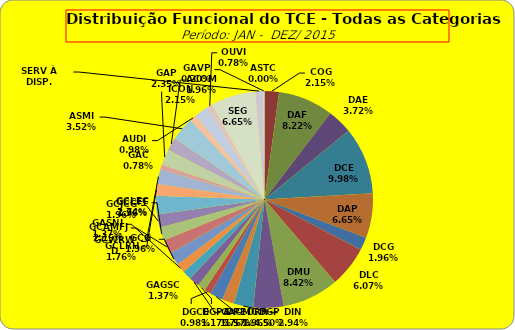
| Category | ASTC COG DAF DAE DCE DAP DCG DLC DMU DGP DIN DPE DRR DGCE DGPA GACMG GAGSC GASNI GCG GCAMFJ GCCFF GCJCG GCLEC GCLRH GCWRWD GAC GAP ACOM ASMI AUDI ICON OUVI SEG SERV À DISP. GAVP |
|---|---|
| ASTC | 0 |
| COG | 11 |
| DAF | 42 |
| DAE | 19 |
| DCE | 51 |
| DAP | 34 |
| DCG | 10 |
| DLC | 31 |
| DMU | 43 |
| DGP | 23 |
| DIN | 15 |
| DPE | 9 |
| DRR | 10 |
| DGCE | 5 |
| DGPA | 6 |
| GACMG | 8 |
| GAGSC | 7 |
| GASNI | 7 |
| GCG | 10 |
| GCAMFJ | 11 |
| GCCFF | 10 |
| GCJCG | 10 |
| GCLEC | 14 |
| GCLRH | 9 |
| GCWRWD | 11 |
| GAC | 4 |
| GAP | 12 |
| ACOM | 10 |
| ASMI | 18 |
| AUDI | 5 |
| ICON | 11 |
| OUVI | 4 |
| SEG | 34 |
| SERV À DISP. | 6 |
| GAVP | 1 |